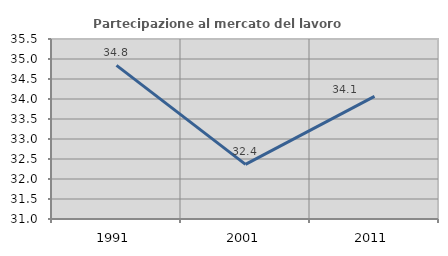
| Category | Partecipazione al mercato del lavoro  femminile |
|---|---|
| 1991.0 | 34.839 |
| 2001.0 | 32.366 |
| 2011.0 | 34.067 |